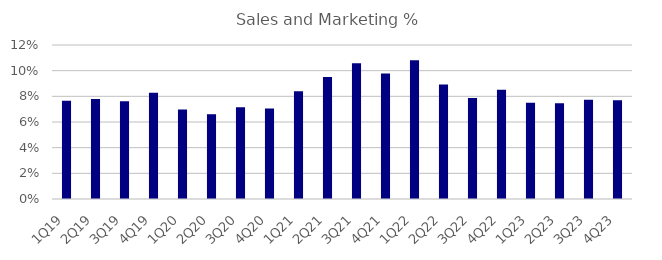
| Category | Sales and Marketing % |
|---|---|
| 1Q19 | 0.077 |
| 2Q19 | 0.078 |
| 3Q19 | 0.076 |
| 4Q19 | 0.083 |
| 1Q20 | 0.07 |
| 2Q20 | 0.066 |
| 3Q20 | 0.071 |
| 4Q20 | 0.07 |
| 1Q21 | 0.084 |
| 2Q21 | 0.095 |
| 3Q21 | 0.106 |
| 4Q21 | 0.098 |
| 1Q22 | 0.108 |
| 2Q22 | 0.089 |
| 3Q22 | 0.079 |
| 4Q22 | 0.085 |
| 1Q23 | 0.075 |
| 2Q23 | 0.075 |
| 3Q23 | 0.077 |
| 4Q23 | 0.077 |